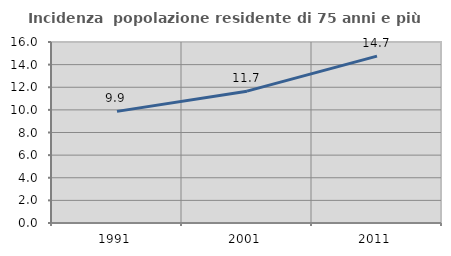
| Category | Incidenza  popolazione residente di 75 anni e più |
|---|---|
| 1991.0 | 9.866 |
| 2001.0 | 11.654 |
| 2011.0 | 14.748 |